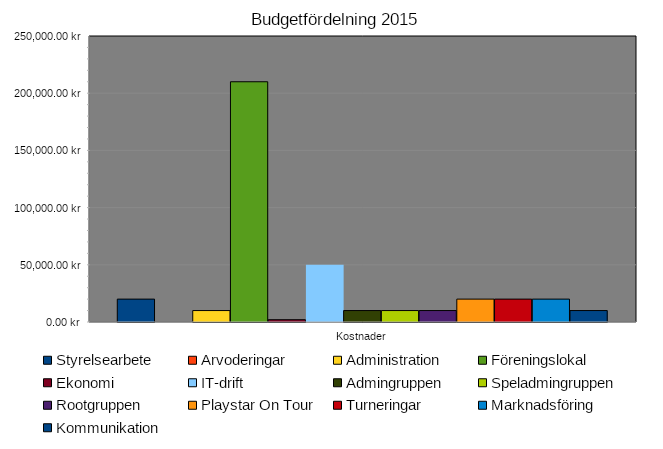
| Category | Styrelsearbete | Arvoderingar | Administration | Föreningslokal | Ekonomi | IT-drift | Admingruppen | Speladmingruppen | Rootgruppen | Playstar On Tour | Turneringar | Marknadsföring | Kommunikation |
|---|---|---|---|---|---|---|---|---|---|---|---|---|---|
| Kostnader | 20000 | 0 | 10000 | 210000 | 2000 | 50000 | 10000 | 10000 | 10000 | 20000 | 20000 | 20000 | 10000 |